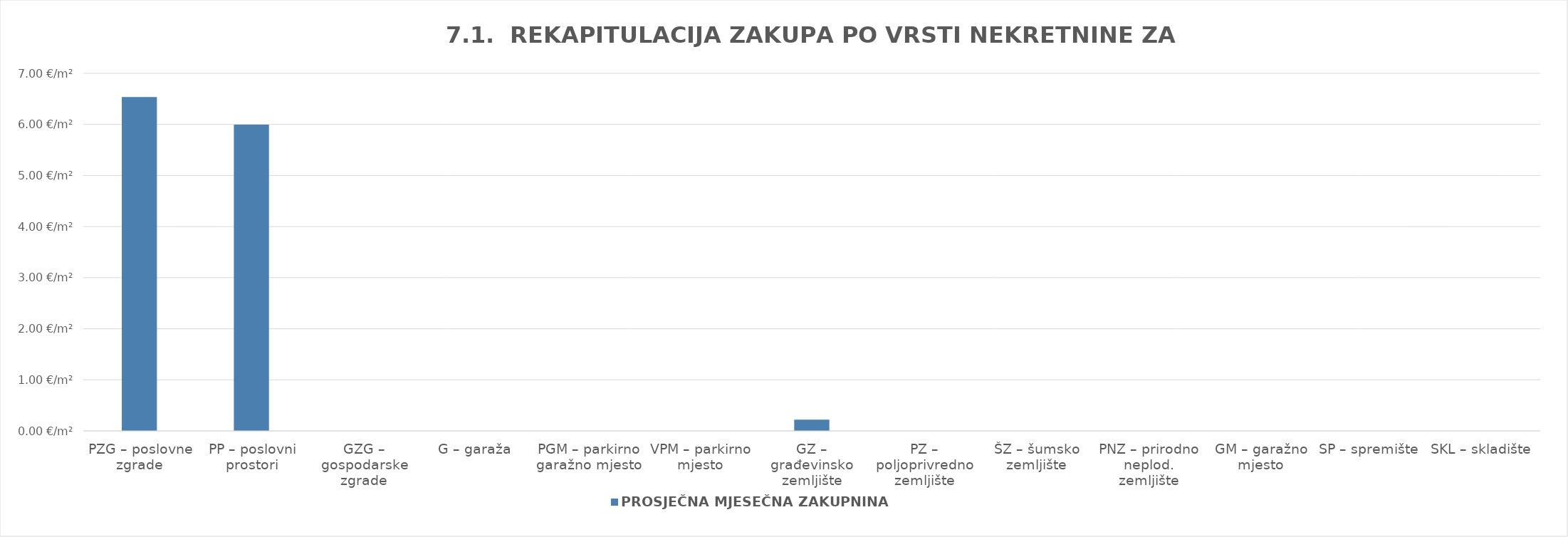
| Category | PROSJEČNA MJESEČNA ZAKUPNINA EUR/m2 |
|---|---|
| PZG – poslovne zgrade | 1900-01-06 12:52:42 |
| PP – poslovni prostori | 1900-01-05 23:56:37 |
| GZG – gospodarske zgrade | 0 |
| G – garaža | 0 |
| PGM – parkirno garažno mjesto | 0 |
| VPM – parkirno mjesto | 0 |
| GZ – građevinsko zemljište | 0.22 |
| PZ – poljoprivredno zemljište | 0 |
| ŠZ – šumsko zemljište | 0 |
| PNZ – prirodno neplod. zemljište | 0 |
| GM – garažno mjesto | 0 |
| SP – spremište  | 0 |
| SKL – skladište  | 0 |